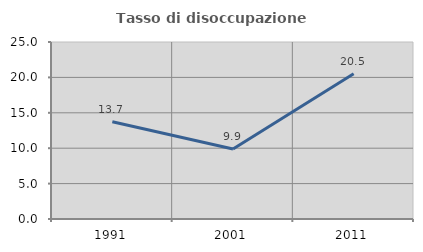
| Category | Tasso di disoccupazione giovanile  |
|---|---|
| 1991.0 | 13.725 |
| 2001.0 | 9.887 |
| 2011.0 | 20.521 |